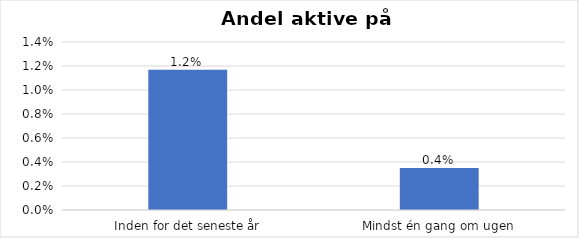
| Category | % |
|---|---|
| Inden for det seneste år | 0.012 |
| Mindst én gang om ugen | 0.004 |